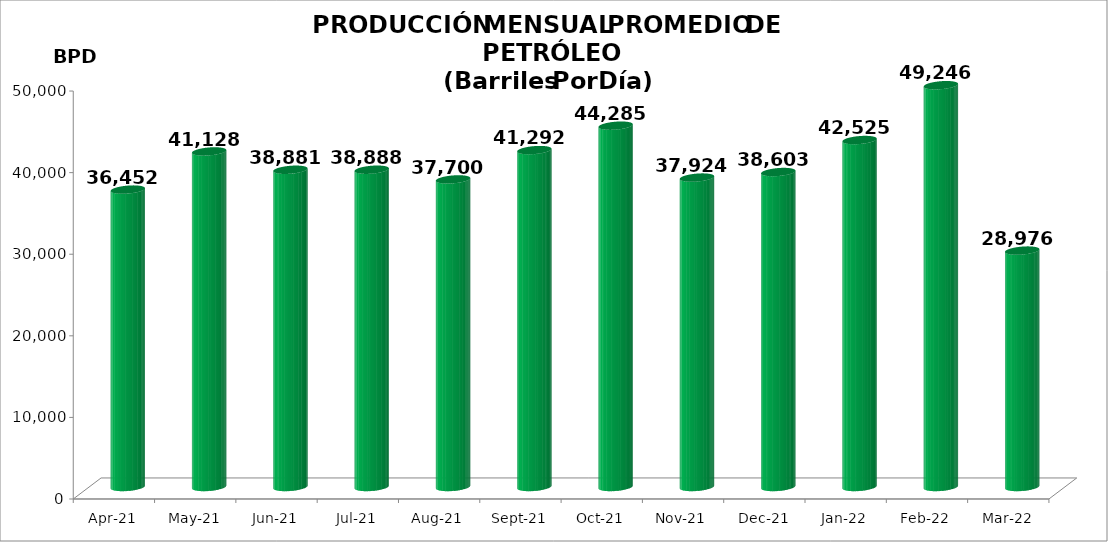
| Category | Series 0 |
|---|---|
| 2021-04-01 | 36452 |
| 2021-05-01 | 41128.032 |
| 2021-06-01 | 38881.4 |
| 2021-07-01 | 38887.645 |
| 2021-08-01 | 37699.645 |
| 2021-09-01 | 41292 |
| 2021-10-01 | 44285 |
| 2021-11-01 | 37924 |
| 2021-12-01 | 38603 |
| 2022-01-01 | 42524.516 |
| 2022-02-01 | 49246 |
| 2022-03-01 | 28976.419 |